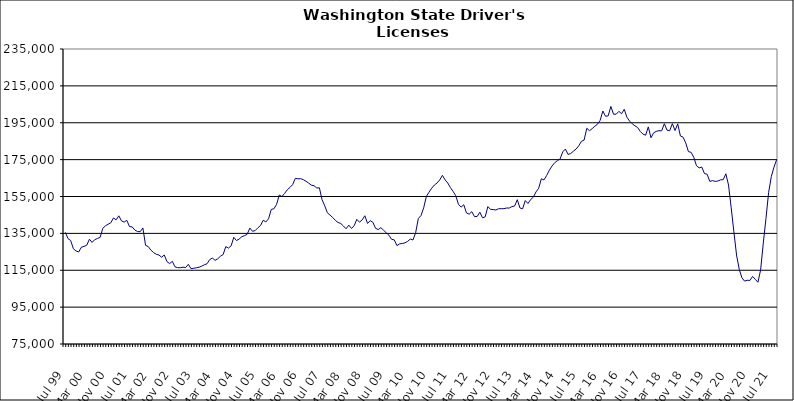
| Category | Series 0 |
|---|---|
| Jul 99 | 135560 |
| Aug 99 | 132182 |
| Sep 99 | 131104 |
| Oct 99 | 126694 |
| Nov 99 | 125425 |
| Dec 99 | 124927 |
| Jan 00 | 127499 |
| Feb 00 | 127927 |
| Mar 00 | 128547 |
| Apr 00 | 131834 |
| May 00 | 130120 |
| Jun 00 | 131595 |
| Jul 00 | 132236 |
| Aug 00 | 132819 |
| Sep 00 | 137711 |
| Oct 00 | 139063 |
| Nov 00 | 139952 |
| Dec 00 | 140732 |
| Jan 01 | 143338 |
| Feb 01 | 142359 |
| Mar 01 | 144523 |
| Apr 01 | 141758 |
| May 01 | 141135 |
| Jun 01 | 142064 |
| Jul 01 | 138646 |
| Aug 01 | 138530 |
| Sep 01 | 136784 |
| Oct 01 | 135996 |
| Nov 01 | 135917 |
| Dec 01 | 137940 |
| Jan 02 | 128531 |
| Feb 02 | 127848 |
| Mar 02 | 125876 |
| Apr 02 | 124595 |
| May 02 | 123660 |
| Jun 02 | 123282 |
| Jul 02 | 122089 |
| Aug 02 | 123279 |
| Sep 02 | 119727 |
| Oct 02 | 118588 |
| Nov 02 | 119854 |
| Dec 02 | 116851 |
| Jan 03 | 116407 |
| Feb 03 | 116382 |
| Mar 03 | 116648 |
| Apr 03 | 116471 |
| May 03 | 118231 |
| Jun 03 | 115831 |
| Jul 03 | 116082 |
| Aug 03 | 116341 |
| Sep 03 | 116653 |
| Oct 03 | 117212 |
| Nov 03 | 117962 |
| Dec 03 | 118542 |
| Jan 04 | 120817 |
| Feb 04 | 121617 |
| Mar 04 | 120369 |
| Apr 04 | 121200 |
| May 04 | 122609 |
| Jun 04 | 123484 |
| Jul 04 | 127844 |
| Aug 04 | 127025 |
| Sep 04 | 128273 |
| Oct 04 | 132853 |
| Nov 04 | 131106 |
| Dec 04 | 131935 |
| Jan 05 | 133205 |
| Feb 05 | 133736 |
| Mar 05 | 134528 |
| Apr 05 | 137889 |
| May 05 | 136130 |
| Jun 05 | 136523 |
| Jul 05 | 137997 |
| Aug 05 | 139294 |
| Sep 05 | 142140 |
| Oct 05 | 141192 |
| Nov 05 | 142937 |
| Dec 05 | 148013 |
| Jan 06 | 148341 |
| Feb 06 | 150744 |
| Mar 06 | 155794 |
| Apr 06 | 154984 |
| May 06 | 156651 |
| Jun 06 | 158638 |
| Jul 06 | 159911 |
| Aug 06 | 161445 |
| Sep 06 | 164852 |
| Oct 06 | 164570 |
| Nov 06 | 164679 |
| Dec 06 | 164127 |
| Jan 07 | 163271 |
| Feb 07 | 162273 |
| Mar 07 | 161140 |
| Apr 07 | 160860 |
| May 07 | 159633 |
| Jun 07 | 159724 |
| Jul 07 | 153303 |
| Aug 07 | 149939 |
| Sep 07 | 146172 |
| Oct 07 | 144876 |
| Nov 07 | 143613 |
| Dec 07 | 142022 |
| Jan 08 | 140909 |
| Feb 08 | 140368 |
| Mar 08 | 138998 |
| Apr 08 | 137471 |
| May 08 | 139453 |
| Jun 08 | 137680 |
| Jul 08 | 139120 |
| Aug 08 | 142612 |
| Sep-08 | 141071 |
| Oct 08 | 142313 |
| Nov 08 | 144556 |
| Dec 08 | 140394 |
| Jan 09 | 141903 |
| Feb 09 | 141036 |
| Mar 09 | 137751 |
| Apr 09 | 137060 |
| May 09 | 138101 |
| Jun 09 | 136739 |
| Jul 09 | 135317 |
| Aug 09 | 134020 |
| Sep 09 | 131756 |
| Oct 09 | 131488 |
| Nov 09 | 128370 |
| Dec 09 | 129323 |
| Jan 10 | 129531 |
| Feb 10 | 129848 |
| Mar 10 | 130654 |
| Apr 10 | 131929 |
| May 10 | 131429 |
| Jun 10 | 135357 |
| Jul 10 | 143032 |
| Aug 10 | 144686 |
| Sep 10 | 148856 |
| Oct 10 | 155042 |
| Nov 10 | 157328 |
| Dec 10 | 159501 |
| Jan 11 | 161221 |
| Feb 11 | 162312 |
| Mar 11 | 163996 |
| Apr 11 | 166495 |
| May 11 | 164040 |
| Jun 11 | 162324 |
| Jul 11 | 159862 |
| Aug 11 | 157738 |
| Sep 11 | 155430 |
| Oct 11 | 150762 |
| Nov 11 | 149255 |
| Dec 11 | 150533 |
| Jan 12 | 146068 |
| Feb 12 | 145446 |
| Mar 12 | 146788 |
| Apr 12 | 144110 |
| May 12 | 144162 |
| Jun 12 | 146482 |
| Jul 12 | 143445 |
| Aug 12 | 143950 |
| Sep 12 | 149520 |
| Oct 12 | 148033 |
| Nov 12 | 147926 |
| Dec 12 | 147674 |
| Jan 13 | 148360 |
| Feb-13 | 148388 |
| Mar-13 | 148414 |
| Apr 13 | 148749 |
| May 13 | 148735 |
| Jun-13 | 149521 |
| Jul 13 | 149837 |
| Aug 13 | 153252 |
| Sep 13 | 148803 |
| Oct 13 | 148315 |
| Nov 13 | 152804 |
| Dec 13 | 151209 |
| Jan 14 | 153357 |
| Feb-14 | 154608 |
| Mar 14 | 157479 |
| Apr 14 | 159441 |
| May 14 | 164591 |
| Jun 14 | 163995 |
| Jul-14 | 166411 |
| Aug-14 | 169272 |
| Sep 14 | 171565 |
| Oct 14 | 173335 |
| Nov 14 | 174406 |
| Dec 14 | 175302 |
| Jan 15 | 179204 |
| Feb 15 | 180737 |
| Mar 15 | 177810 |
| Apr-15 | 178331 |
| May 15 | 179601 |
| Jun-15 | 180729 |
| Jul 15 | 182540 |
| Aug 15 | 184924 |
| Sep 15 | 185620 |
| Oct 15 | 192002 |
| Nov 15 | 190681 |
| Dec 15 | 191795 |
| Jan 16 | 193132 |
| Feb 16 | 194206 |
| Mar 16 | 196319 |
| Apr 16 | 201373 |
| May 16 | 198500 |
| Jun 16 | 198743 |
| Jul 16 | 203841 |
| Aug 16 | 199630 |
| Sep 16 | 199655 |
| Oct 16 | 201181 |
| Nov 16 | 199888 |
| Dec 16 | 202304 |
| Jan 17 | 197977 |
| Feb 17 | 195889 |
| Mar 17 | 194438 |
| Apr 17 | 193335 |
| May 17 | 192430 |
| Jun 17 | 190298 |
| Jul 17 | 188832 |
| Aug 17 | 188264 |
| Sep 17 | 192738 |
| Oct 17 | 186856 |
| Nov 17 | 189537 |
| Dec 17 | 190341 |
| Jan 18 | 190670 |
| Feb 18 | 190645 |
| Mar 18 | 194476 |
| Apr 18 | 190971 |
| May 18 | 190707 |
| Jun 18 | 194516 |
| Jul 18 | 190783 |
| Aug 18 | 194390 |
| Sep 18 | 187831 |
| Oct 18 | 187188 |
| Nov 18 | 184054 |
| Dec 18 | 179347 |
| Jan 19 | 178958 |
| Feb 19 | 176289 |
| Mar 19 | 171747 |
| Apr 19 | 170532 |
| May 19 | 170967 |
| Jun 19 | 167444 |
| Jul 19 | 167059 |
| Aug 19 | 163194 |
| Sep 19 | 163599 |
| Oct 19 | 163212 |
| Nov 19 | 163388 |
| Dec 19 | 164024 |
| Jan 20 | 164114 |
| Feb 20 | 167320 |
| Mar 20 | 161221 |
| Apr 20 | 148866 |
| May 20 | 135821 |
| Jun 20 | 123252 |
| Jul 20 | 115526 |
| Aug 20 | 110940 |
| Sep 20 | 109099 |
| Oct 20 | 109566 |
| Nov 20 | 109488 |
| Dec 20 | 111658 |
| Jan 21 | 110070 |
| Feb 21 | 108491 |
| Mar 21 | 115176 |
| Apr 21 | 129726 |
| May 21 | 143052 |
| Jun 21 | 157253 |
| Jul 21 | 165832 |
| Aug 21 | 170937 |
| Sep 21 | 175042 |